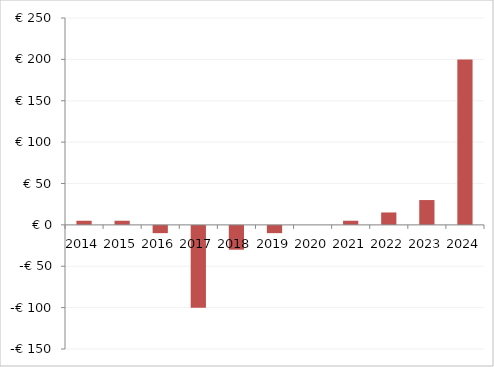
| Category | Series 1 |
|---|---|
| 2014.0 | 5 |
| 2015.0 | 5 |
| 2016.0 | -10 |
| 2017.0 | -100 |
| 2018.0 | -30 |
| 2019.0 | -10 |
| 2020.0 | 0 |
| 2021.0 | 5 |
| 2022.0 | 15 |
| 2023.0 | 30 |
| 2024.0 | 200 |